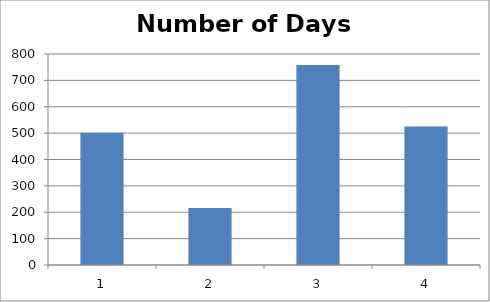
| Category | Number of Days (Absolute) |
|---|---|
| 0 | 501 |
| 1 | 216 |
| 2 | 758 |
| 3 | 525 |